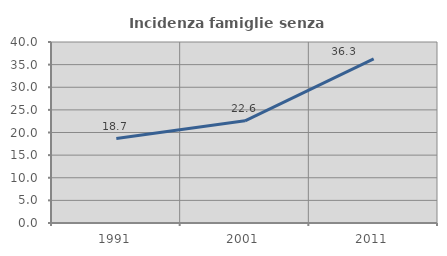
| Category | Incidenza famiglie senza nuclei |
|---|---|
| 1991.0 | 18.667 |
| 2001.0 | 22.581 |
| 2011.0 | 36.264 |